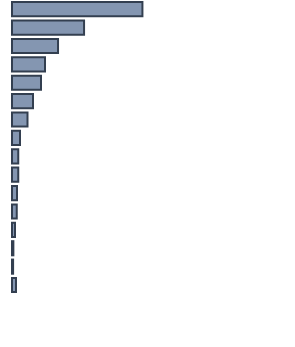
| Category | Series 0 |
|---|---|
| 0 | 47.6 |
| 1 | 26.3 |
| 2 | 16.8 |
| 3 | 12 |
| 4 | 10.6 |
| 5 | 7.7 |
| 6 | 5.7 |
| 7 | 2.9 |
| 8 | 2.3 |
| 9 | 2.3 |
| 10 | 1.8 |
| 11 | 1.7 |
| 12 | 1.1 |
| 13 | 0.5 |
| 14 | 0.4 |
| 15 | 1.5 |
| 16 | 0 |
| 17 | 0 |